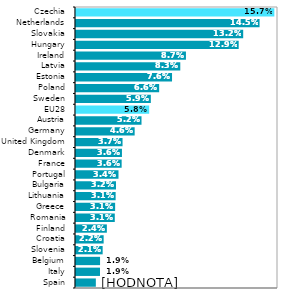
| Category | 2019 |
|---|---|
| Spain | 0.016 |
| Italy | 0.019 |
| Belgium | 0.019 |
| Slovenia | 0.021 |
| Croatia | 0.022 |
| Finland | 0.024 |
| Romania | 0.031 |
| Greece | 0.031 |
| Lithuania | 0.031 |
| Bulgaria | 0.032 |
| Portugal | 0.034 |
| France | 0.036 |
| Denmark | 0.036 |
| United Kingdom | 0.037 |
| Germany | 0.046 |
| Austria | 0.052 |
| EU28 | 0.058 |
| Sweden | 0.059 |
| Poland | 0.066 |
| Estonia | 0.076 |
| Latvia | 0.083 |
| Ireland | 0.087 |
| Hungary | 0.129 |
| Slovakia | 0.132 |
| Netherlands | 0.145 |
| Czechia | 0.157 |